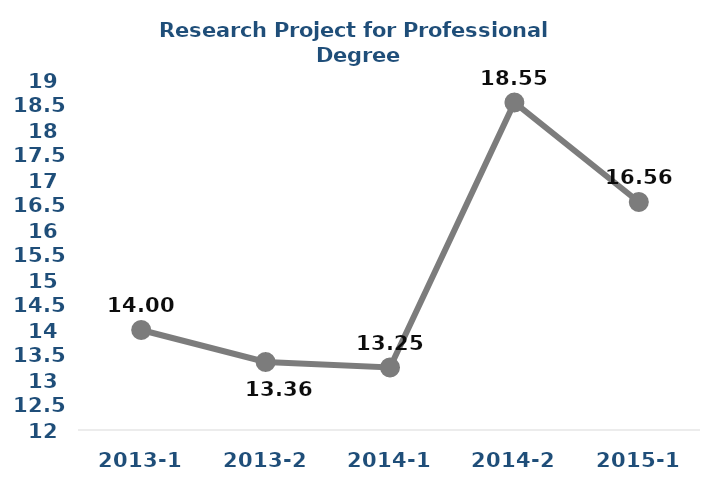
| Category | Series 0 |
|---|---|
| 2013-1 | 14 |
| 2013-2 | 13.36 |
| 2014-1 | 13.25 |
| 2014-2 | 18.55 |
| 2015-1 | 16.56 |